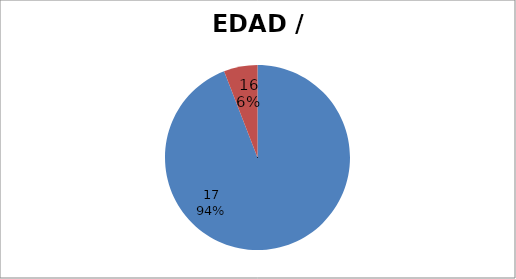
| Category | 16 | Series 1 | Series 2 | Series 3 |
|---|---|---|---|---|
| 0 |  | 17 | 16 | 17 |
| 1 |  | 5 | 1 | 5 |